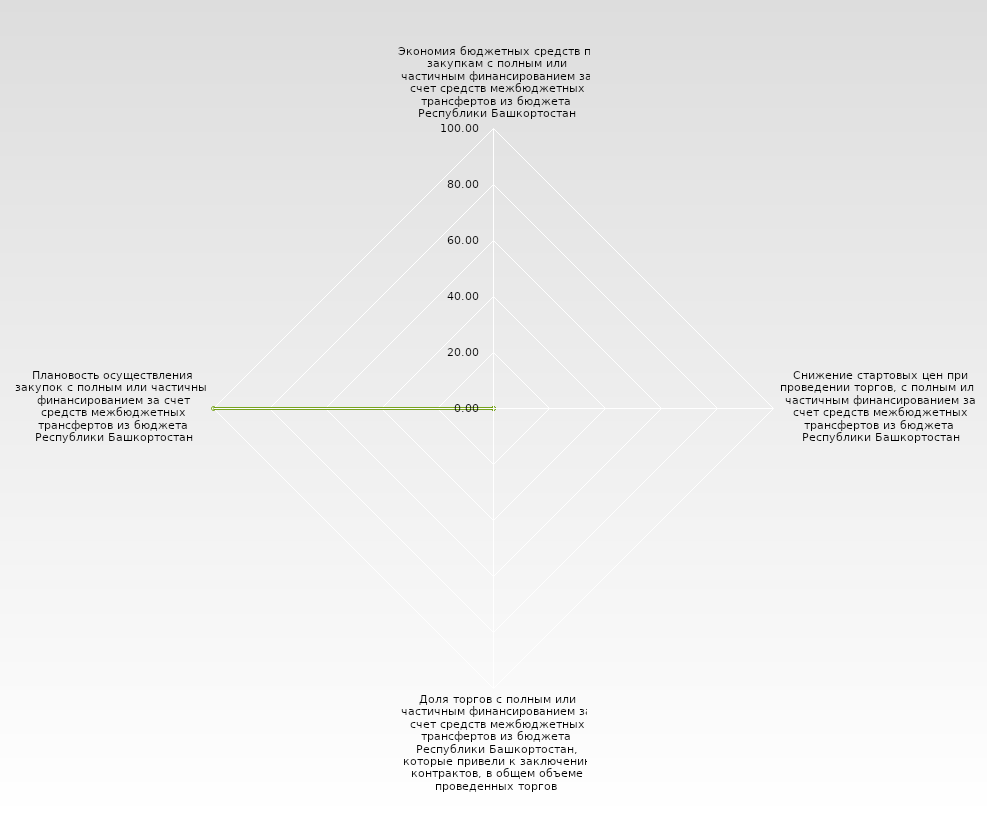
| Category | Series 0 |
|---|---|
| Экономия бюджетных средств по закупкам с полным или частичным финансированием за счет средств межбюджетных трансфертов из бюджета Республики Башкортостан | 0 |
| Снижение стартовых цен при проведении торгов, с полным или частичным финансированием за счет средств межбюджетных трансфертов из бюджета Республики Башкортостан | 0 |
| Доля торгов с полным или частичным финансированием за счет средств межбюджетных трансфертов из бюджета Республики Башкортостан, которые привели к заключению контрактов, в общем объеме проведенных торгов | 0 |
| Плановость осуществления закупок с полным или частичным финансированием за счет средств межбюджетных трансфертов из бюджета Республики Башкортостан | 100 |